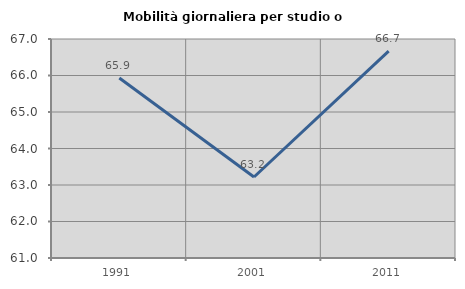
| Category | Mobilità giornaliera per studio o lavoro |
|---|---|
| 1991.0 | 65.932 |
| 2001.0 | 63.218 |
| 2011.0 | 66.667 |